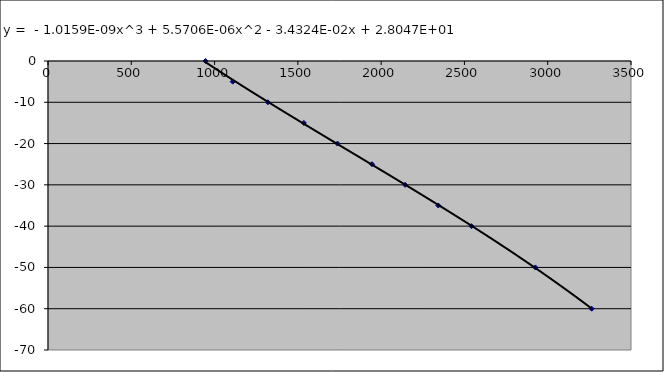
| Category | Series 0 |
|---|---|
| 946.0 | 0 |
| 1109.0 | -5 |
| 1320.0 | -10 |
| 1536.0 | -15 |
| 1738.0 | -20 |
| 1945.0 | -25 |
| 2144.0 | -30 |
| 2343.0 | -35 |
| 2542.0 | -40 |
| 2926.0 | -50 |
| 3264.0 | -60 |